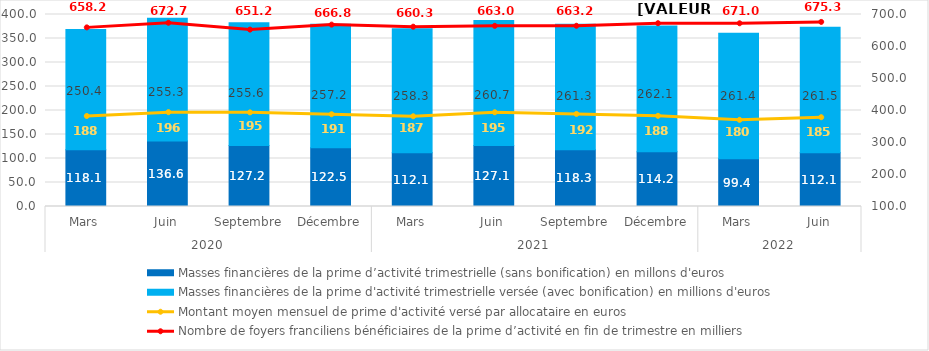
| Category | Masses financières de la prime d’activité trimestrielle (sans bonification) en millons d'euros | Masses financières de la prime d'activité trimestrielle versée (avec bonification) en millions d'euros |
|---|---|---|
| 0 | 118.111 | 250.431 |
| 1 | 136.63 | 255.3 |
| 2 | 127.154 | 255.587 |
| 3 | 122.515 | 257.215 |
| 4 | 112.083 | 258.285 |
| 5 | 127.058 | 260.695 |
| 6 | 118.344 | 261.303 |
| 7 | 114.23 | 262.055 |
| 8 | 99.42 | 261.4 |
| 9 | 112.13 | 261.5 |